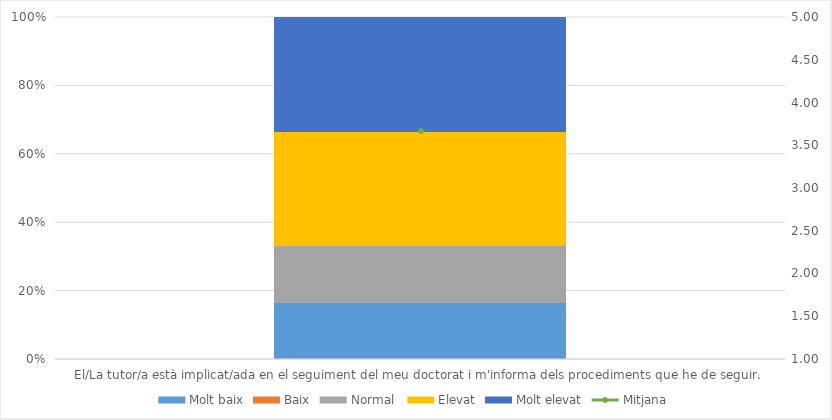
| Category | Molt baix | Baix | Normal  | Elevat | Molt elevat |
|---|---|---|---|---|---|
| El/La tutor/a està implicat/ada en el seguiment del meu doctorat i m'informa dels procediments que he de seguir.  | 1 | 0 | 1 | 2 | 2 |